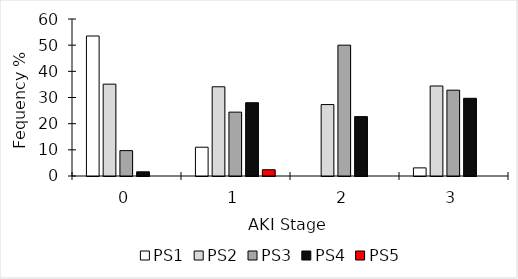
| Category | PS1 | PS2 | PS3 | PS4 | PS5 |
|---|---|---|---|---|---|
| 0.0 | 53.5 | 35.1 | 9.7 | 1.6 | 0 |
| 1.0 | 11 | 34.1 | 24.4 | 28 | 2.4 |
| 2.0 | 0 | 27.3 | 50 | 22.7 | 0 |
| 3.0 | 3.1 | 34.4 | 32.8 | 29.7 | 0 |